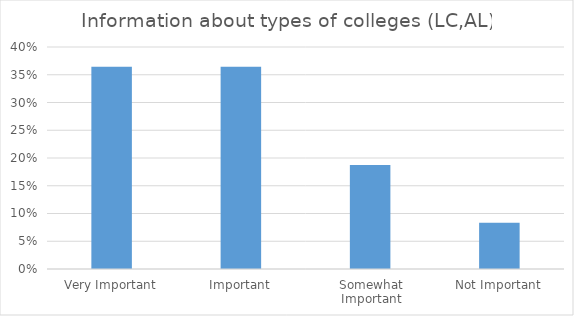
| Category | Information about types of colleges (LC,AL) |
|---|---|
| Very Important | 0.365 |
| Important | 0.365 |
| Somewhat Important | 0.188 |
| Not Important | 0.083 |